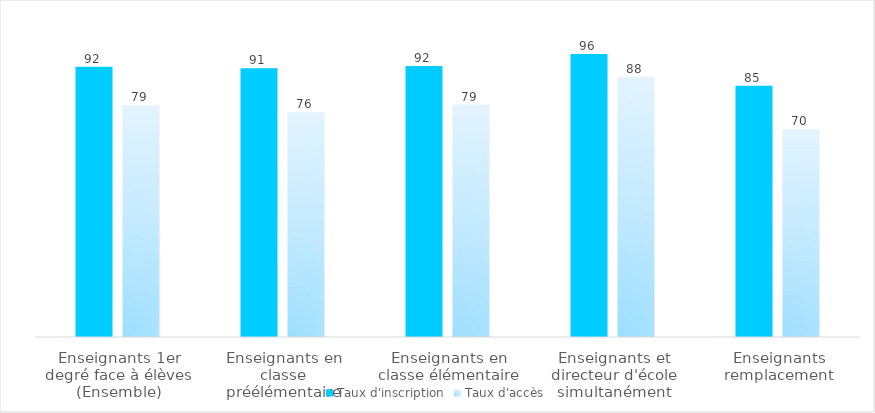
| Category | Taux d'inscription | Taux d'accès |
|---|---|---|
| Enseignants 1er degré face à élèves (Ensemble) | 91.6 | 78.6 |
| Enseignants en classe préélémentaire | 91.1 | 76.2 |
| Enseignants en classe élémentaire | 91.9 | 78.8 |
| Enseignants et directeur d'école simultanément | 95.9 | 88.2 |
| Enseignants remplacement | 85.2 | 70.4 |